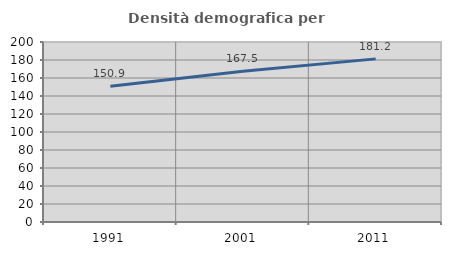
| Category | Densità demografica |
|---|---|
| 1991.0 | 150.945 |
| 2001.0 | 167.542 |
| 2011.0 | 181.249 |